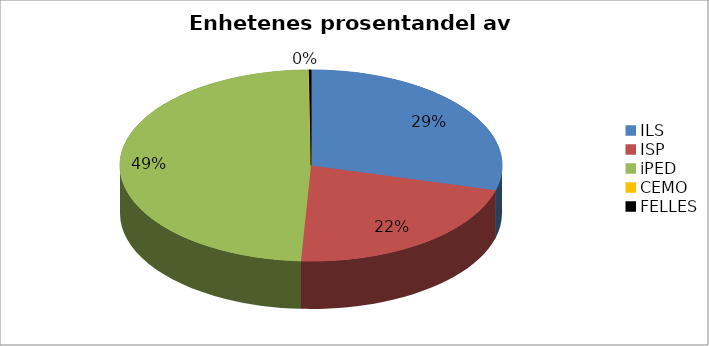
| Category | Series 0 |
|---|---|
| ILS | 5799066.667 |
| ISP | 4305600 |
| iPED | 9736666.667 |
| CEMO | 0 |
| FELLES | 36800 |